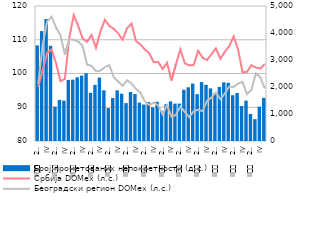
| Category | Број прометованих непокретности (д.с.) |
|---|---|
| II
     2008. | 3540 |
| III | 4071 |
| IV | 4515 |
| I
2009. | 3524 |
| II
     2009. | 1271 |
| III | 1521 |
| IV
 | 1495 |
| I
2010. | 2262 |
| II
     2010. | 2272 |
| III | 2357 |
| IV | 2422 |
| I
2011. | 2508 |
| II
     2011. | 1782 |
| III | 2078 |
| IV | 2347 |
| I
2012. | 1877 |
| II
     2012. | 1218 |
| III | 1592 |
| IV | 1875 |
| I
2013. | 1752 |
| II
     2013. | 1403 |
| III | 1813 |
| IV | 1741 |
| I
2014. | 1424 |
| II
     2014. | 1351 |
| III | 1443 |
| IV | 1247 |
| I
2015. | 1451 |
| II
     2015. | 1113 |
| III | 1363 |
| IV | 1466 |
| I
2016. | 1385 |
| II
     2016. | 1384 |
| III | 1897 |
| IV | 1989 |
| I
2017. | 2128 |
| II
     2017. | 1735 |
| III | 2181 |
| IV | 2081 |
| I
2018. | 1948 |
| II
     2018. | 1765 |
| III | 1999 |
| IV | 2171 |
| I
2019. | 2154 |
| II
     2019. | 1697 |
| III | 1778 |
| IV | 1295 |
| I
2020. | 1496 |
| II
     2020. | 1000 |
| III | 807 |
| IV | 1269 |